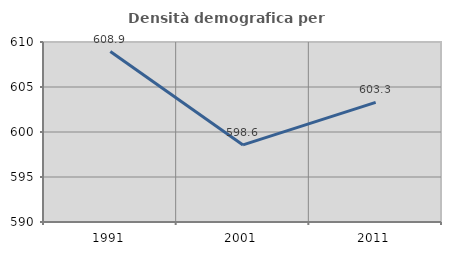
| Category | Densità demografica |
|---|---|
| 1991.0 | 608.937 |
| 2001.0 | 598.562 |
| 2011.0 | 603.295 |